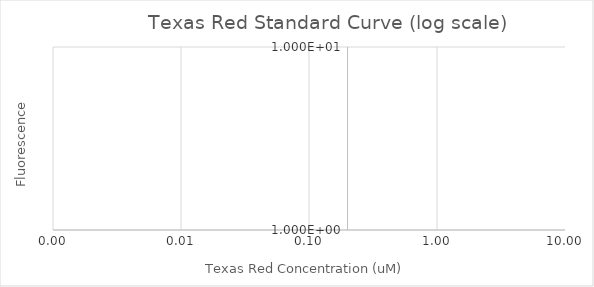
| Category | Series 1 |
|---|---|
| 2.0 | 0 |
| 1.0 | 0 |
| 0.5 | 0 |
| 0.25 | 0 |
| 0.125 | 0 |
| 0.0625 | 0 |
| 0.03125 | 0 |
| 0.015625 | 0 |
| 0.0078125 | 0 |
| 0.00390625 | 0 |
| 0.001953125 | 0 |